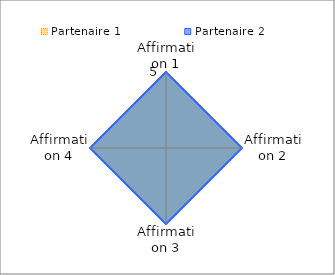
| Category | Partenaire 1 | Partenaire 2 |
|---|---|---|
| Affirmation 1 | 5 | 5 |
| Affirmation 2 | 5 | 5 |
| Affirmation 3 | 5 | 5 |
| Affirmation 4 | 5 | 5 |